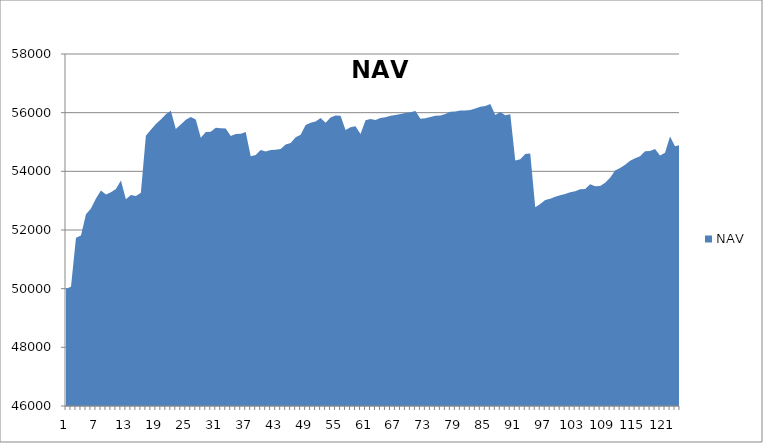
| Category | NAV |
|---|---|
| 0 | 50000 |
| 1 | 50069.444 |
| 2 | 51736.444 |
| 3 | 51809.343 |
| 4 | 52539.343 |
| 5 | 52733.57 |
| 6 | 53070.527 |
| 7 | 53346.212 |
| 8 | 53210.13 |
| 9 | 53285.788 |
| 10 | 53396.685 |
| 11 | 53684.185 |
| 12 | 53050.597 |
| 13 | 53191.058 |
| 14 | 53162.649 |
| 15 | 53270.317 |
| 16 | 55214.762 |
| 17 | 55418.583 |
| 18 | 55617.273 |
| 19 | 55770.477 |
| 20 | 55945.477 |
| 21 | 56069.601 |
| 22 | 55444.601 |
| 23 | 55597.925 |
| 24 | 55757.558 |
| 25 | 55851.308 |
| 26 | 55764.06 |
| 27 | 55148.361 |
| 28 | 55340.028 |
| 29 | 55349.317 |
| 30 | 55485.393 |
| 31 | 55468.704 |
| 32 | 55461.038 |
| 33 | 55205.356 |
| 34 | 55270.356 |
| 35 | 55282.57 |
| 36 | 55341.011 |
| 37 | 54517.482 |
| 38 | 54554.291 |
| 39 | 54731.016 |
| 40 | 54679.093 |
| 41 | 54730.595 |
| 42 | 54736.73 |
| 43 | 54765.085 |
| 44 | 54915.643 |
| 45 | 54969.86 |
| 46 | 55164.665 |
| 47 | 55247.746 |
| 48 | 55575.668 |
| 49 | 55657.905 |
| 50 | 55701.032 |
| 51 | 55819.28 |
| 52 | 55652.834 |
| 53 | 55838.604 |
| 54 | 55905.769 |
| 55 | 55898.888 |
| 56 | 55410.9 |
| 57 | 55504.564 |
| 58 | 55537.603 |
| 59 | 55268.471 |
| 60 | 55737.858 |
| 61 | 55785.708 |
| 62 | 55749.829 |
| 63 | 55815.591 |
| 64 | 55842.34 |
| 65 | 55894.021 |
| 66 | 55916.828 |
| 67 | 55955.697 |
| 68 | 55991.896 |
| 69 | 56012.065 |
| 70 | 56060.293 |
| 71 | 55791.443 |
| 72 | 55810.674 |
| 73 | 55852.843 |
| 74 | 55892.018 |
| 75 | 55900.069 |
| 76 | 55955.739 |
| 77 | 56030.918 |
| 78 | 56036.168 |
| 79 | 56069.975 |
| 80 | 56071.656 |
| 81 | 56090.406 |
| 82 | 56141.798 |
| 83 | 56199.159 |
| 84 | 56228.237 |
| 85 | 56292.573 |
| 86 | 55924.369 |
| 87 | 56019.106 |
| 88 | 55916.165 |
| 89 | 55950.09 |
| 90 | 54367.13 |
| 91 | 54411.811 |
| 92 | 54588.933 |
| 93 | 54611.197 |
| 94 | 52777.117 |
| 95 | 52883.107 |
| 96 | 53025.651 |
| 97 | 53064.908 |
| 98 | 53135.652 |
| 99 | 53186.005 |
| 100 | 53229.789 |
| 101 | 53290.192 |
| 102 | 53319.038 |
| 103 | 53392.112 |
| 104 | 53401.462 |
| 105 | 53559.878 |
| 106 | 53489.526 |
| 107 | 53501.684 |
| 108 | 53607.597 |
| 109 | 53785.178 |
| 110 | 54030.211 |
| 111 | 54113.452 |
| 112 | 54226.272 |
| 113 | 54358.625 |
| 114 | 54444.736 |
| 115 | 54518.421 |
| 116 | 54681.882 |
| 117 | 54693.454 |
| 118 | 54759.719 |
| 119 | 54542.637 |
| 120 | 54631.804 |
| 121 | 55189.582 |
| 122 | 54857.283 |
| 123 | 54902.45 |